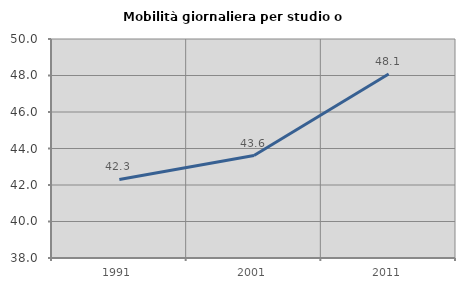
| Category | Mobilità giornaliera per studio o lavoro |
|---|---|
| 1991.0 | 42.302 |
| 2001.0 | 43.612 |
| 2011.0 | 48.087 |